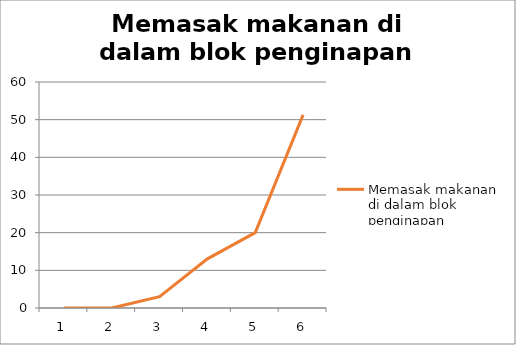
| Category | Memasak makanan di dalam blok penginapan |
|---|---|
| 0 | 0 |
| 1 | 0 |
| 2 | 3 |
| 3 | 13.043 |
| 4 | 20 |
| 5 | 51.282 |